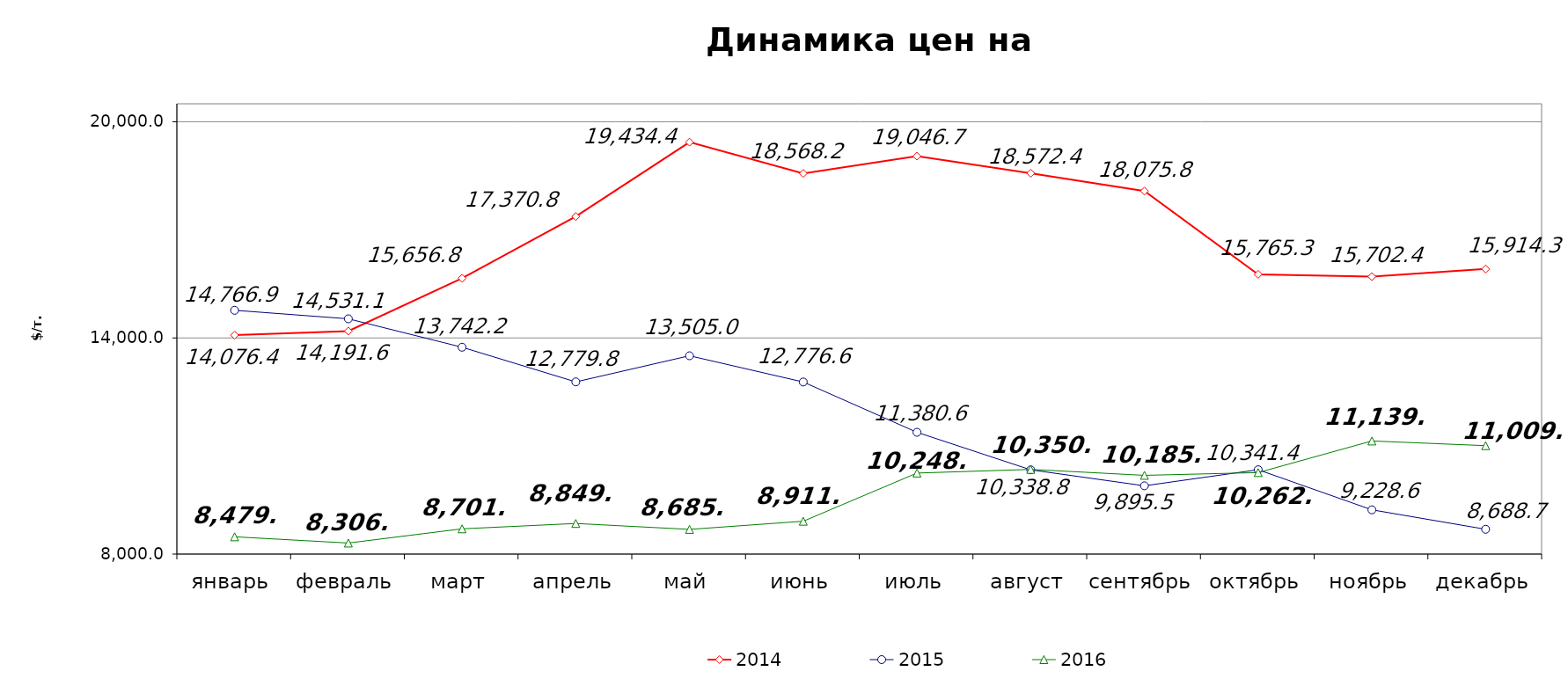
| Category | 2014 | 2015 | 2016 |
|---|---|---|---|
| январь | 14076.37 | 14766.91 | 8479.88 |
| февраль | 14191.63 | 14531.125 | 8306.427 |
| март | 15656.79 | 13742.161 | 8700.954 |
| апрель | 17370.75 | 12779.75 | 8849.65 |
| май | 19434.38 | 13504.999 | 8685.88 |
| июнь | 18568.22 | 12776.591 | 8911.702 |
| июль | 19046.737 | 11380.55 | 10248.927 |
| август | 18572.375 | 10338.75 | 10350.567 |
| сентябрь | 18075.8 | 9895.46 | 10185.57 |
| октябрь | 15765.33 | 10341.37 | 10262.27 |
| ноябрь | 15702.38 | 9228.571 | 11139.772 |
| декабрь | 15914.29 | 8688.691 | 11009.75 |